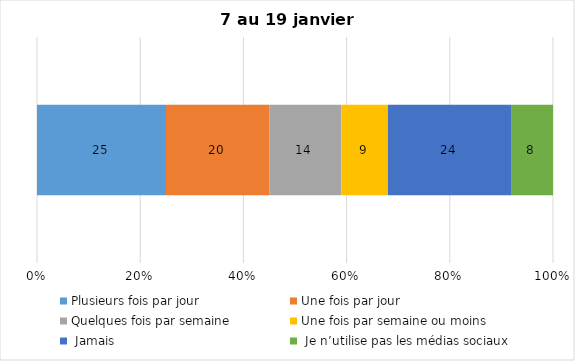
| Category | Plusieurs fois par jour | Une fois par jour | Quelques fois par semaine   | Une fois par semaine ou moins   |  Jamais   |  Je n’utilise pas les médias sociaux |
|---|---|---|---|---|---|---|
| 0 | 25 | 20 | 14 | 9 | 24 | 8 |